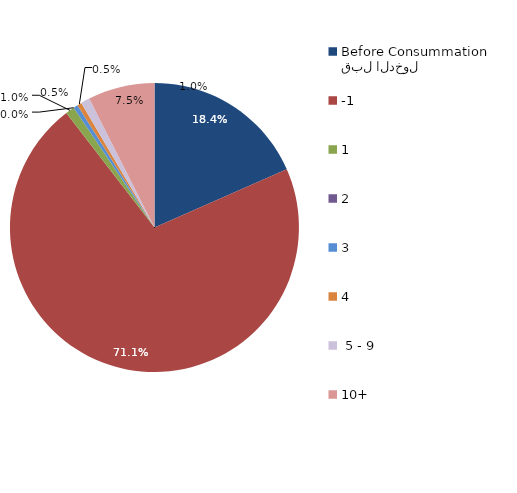
| Category | Series 0 |
|---|---|
| قبل الدخول
Before Consummation | 18.408 |
| -1 | 71.144 |
| 1 | 0.995 |
| 2 | 0 |
| 3 | 0.498 |
| 4 | 0.498 |
|  5 - 9 | 0.995 |
| 10+ | 7.463 |